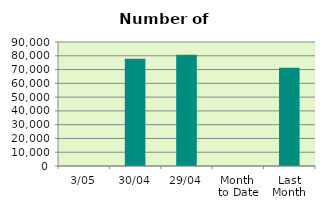
| Category | Series 0 |
|---|---|
| 3/05 | 0 |
| 30/04 | 77834 |
| 29/04 | 80694 |
| Month 
to Date | 0 |
| Last
Month | 71251.4 |